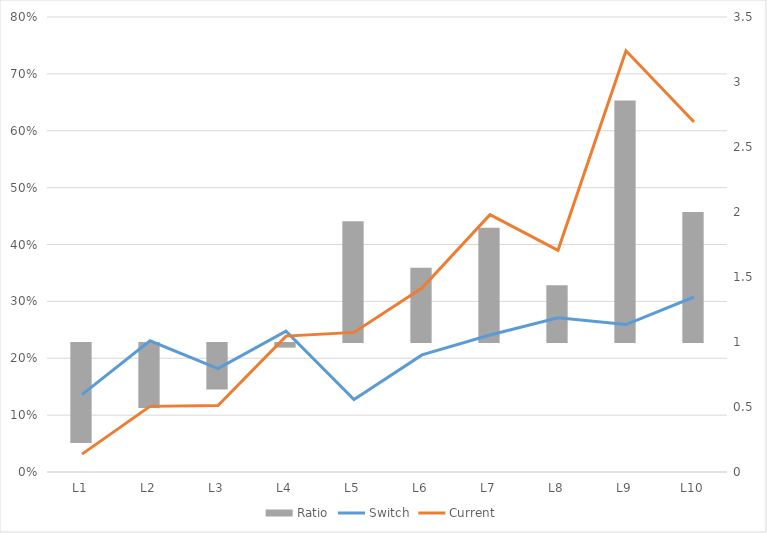
| Category | Ratio |
|---|---|
| L1 | 0.231 |
| L2 | 0.5 |
| L3 | 0.643 |
| L4 | 0.964 |
| L5 | 1.929 |
| L6 | 1.571 |
| L7 | 1.879 |
| L8 | 1.438 |
| L9 | 2.857 |
| L10 | 2 |